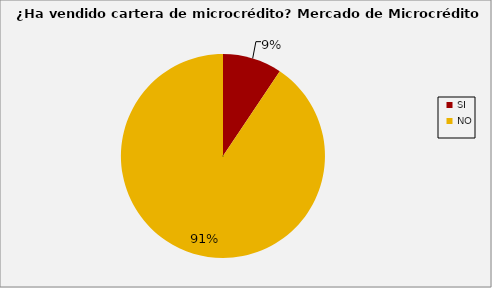
| Category | Series 0 |
|---|---|
| SI | 0.094 |
| NO | 0.906 |